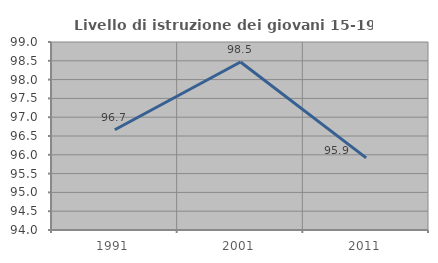
| Category | Livello di istruzione dei giovani 15-19 anni |
|---|---|
| 1991.0 | 96.667 |
| 2001.0 | 98.467 |
| 2011.0 | 95.918 |